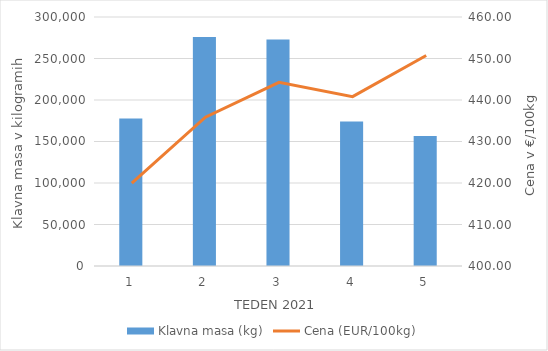
| Category | Klavna masa (kg) |
|---|---|
| 1.0 | 177573 |
| 2.0 | 275951 |
| 3.0 | 272797 |
| 4.0 | 174056 |
| 5.0 | 156508 |